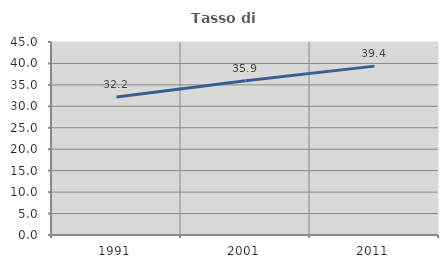
| Category | Tasso di occupazione   |
|---|---|
| 1991.0 | 32.164 |
| 2001.0 | 35.941 |
| 2011.0 | 39.376 |